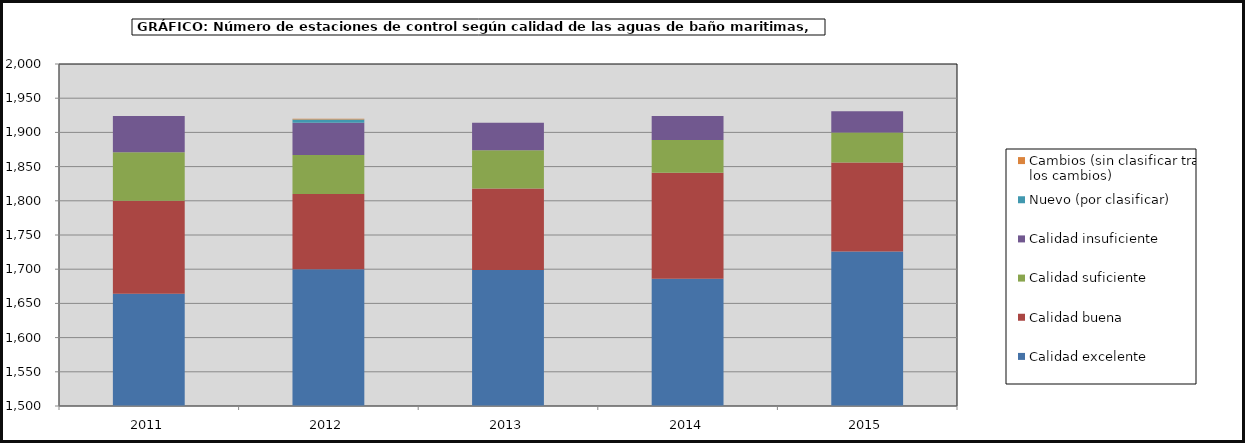
| Category | Calidad excelente | Calidad buena  | Calidad suficiente | Calidad insuficiente | Nuevo (por clasificar) | Cambios (sin clasificar tras los cambios) |
|---|---|---|---|---|---|---|
| 2011.0 | 1664 | 136 | 71 | 53 | 0 | 0 |
| 2012.0 | 1700 | 110 | 57 | 47 | 5 | 1 |
| 2013.0 | 1699 | 119 | 56 | 40 | 0 | 0 |
| 2014.0 | 1686 | 155 | 48 | 35 | 0 | 0 |
| 2015.0 | 1726 | 130 | 44 | 31 | 0 | 0 |